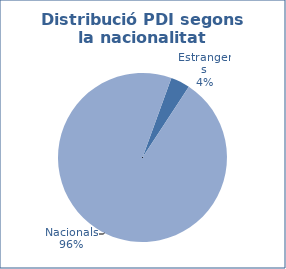
| Category | Series 0 |
|---|---|
| Estrangers | 94 |
| Nacionals | 2458 |